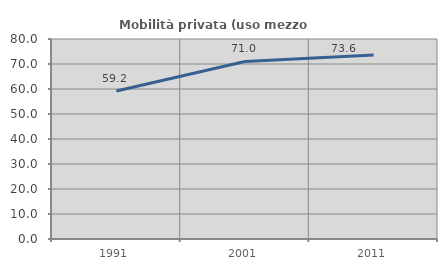
| Category | Mobilità privata (uso mezzo privato) |
|---|---|
| 1991.0 | 59.169 |
| 2001.0 | 71.014 |
| 2011.0 | 73.559 |